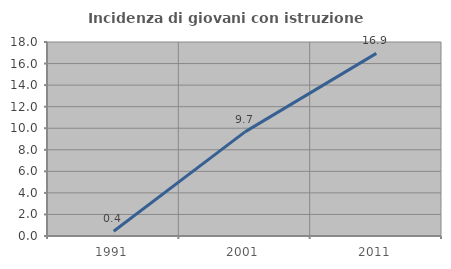
| Category | Incidenza di giovani con istruzione universitaria |
|---|---|
| 1991.0 | 0.444 |
| 2001.0 | 9.662 |
| 2011.0 | 16.942 |